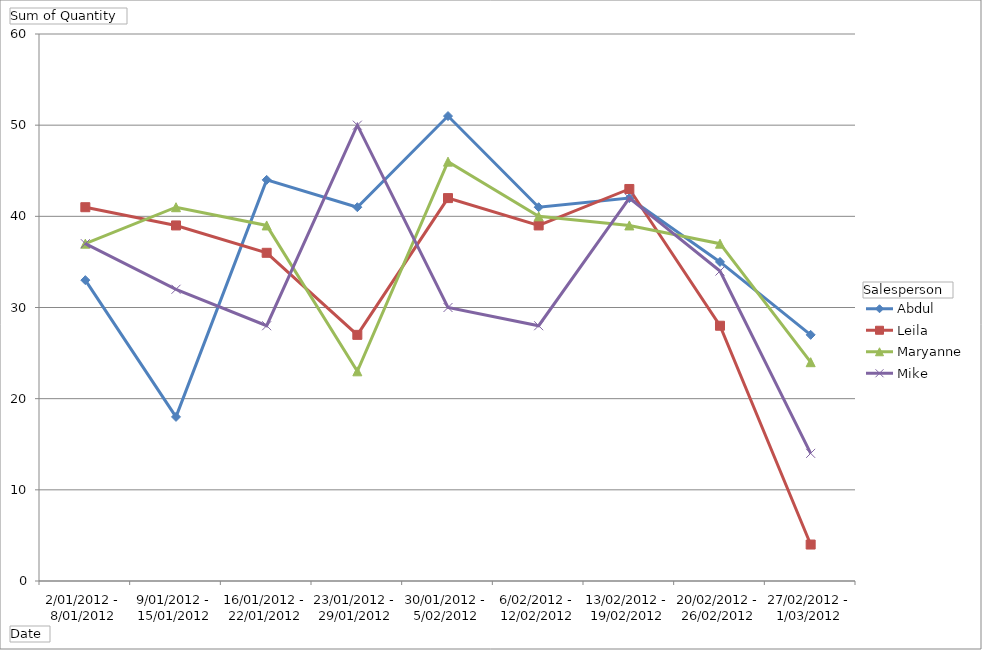
| Category | Abdul | Leila | Maryanne | Mike |
|---|---|---|---|---|
| 2/01/2012 - 8/01/2012 | 33 | 41 | 37 | 37 |
| 9/01/2012 - 15/01/2012 | 18 | 39 | 41 | 32 |
| 16/01/2012 - 22/01/2012 | 44 | 36 | 39 | 28 |
| 23/01/2012 - 29/01/2012 | 41 | 27 | 23 | 50 |
| 30/01/2012 - 5/02/2012 | 51 | 42 | 46 | 30 |
| 6/02/2012 - 12/02/2012 | 41 | 39 | 40 | 28 |
| 13/02/2012 - 19/02/2012 | 42 | 43 | 39 | 42 |
| 20/02/2012 - 26/02/2012 | 35 | 28 | 37 | 34 |
| 27/02/2012 - 1/03/2012 | 27 | 4 | 24 | 14 |